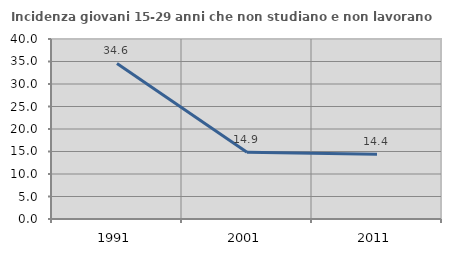
| Category | Incidenza giovani 15-29 anni che non studiano e non lavorano  |
|---|---|
| 1991.0 | 34.568 |
| 2001.0 | 14.857 |
| 2011.0 | 14.368 |